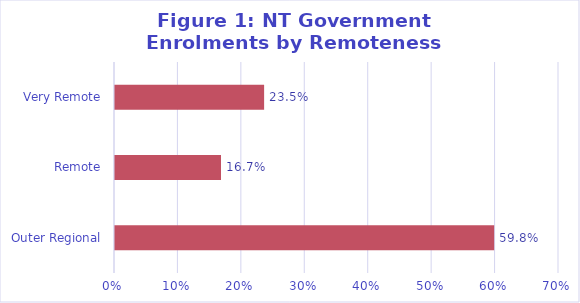
| Category | Series 0 |
|---|---|
| Outer Regional | 0.598 |
| Remote | 0.167 |
| Very Remote | 0.235 |